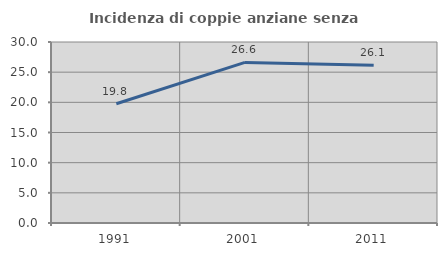
| Category | Incidenza di coppie anziane senza figli  |
|---|---|
| 1991.0 | 19.76 |
| 2001.0 | 26.619 |
| 2011.0 | 26.126 |